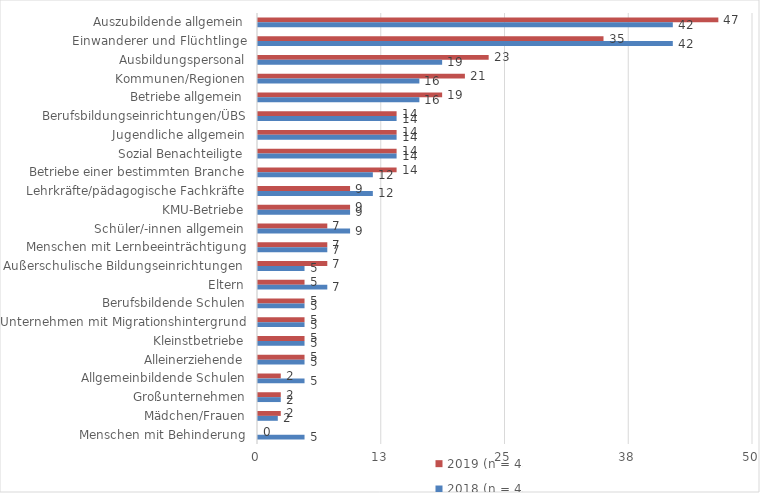
| Category | 2019 (n = 43) | 2018 (n = 43) |
|---|---|---|
| Auszubildende allgemein | 46.5 | 41.9 |
| Einwanderer und Flüchtlinge | 34.9 | 41.9 |
| Ausbildungspersonal | 23.3 | 18.6 |
| Kommunen/Regionen | 20.9 | 16.3 |
| Betriebe allgemein | 18.6 | 16.3 |
| Berufsbildungseinrichtungen/ÜBS | 14 | 14 |
| Jugendliche allgemein | 14 | 14 |
| Sozial Benachteiligte | 14 | 14 |
| Betriebe einer bestimmten Branche | 14 | 11.6 |
| Lehrkräfte/pädagogische Fachkräfte | 9.3 | 11.6 |
| KMU-Betriebe | 9.3 | 9.3 |
| Schüler/-innen allgemein | 7 | 9.3 |
| Menschen mit Lernbeeinträchtigung | 7 | 7 |
| Außerschulische Bildungseinrichtungen  | 7 | 4.7 |
| Eltern | 4.7 | 7 |
| Berufsbildende Schulen | 4.7 | 4.7 |
| Unternehmen mit Migrationshintergrund | 4.7 | 4.7 |
| Kleinstbetriebe | 4.7 | 4.7 |
| Alleinerziehende | 4.7 | 4.7 |
| Allgemeinbildende Schulen | 2.3 | 4.7 |
| Großunternehmen | 2.3 | 2.3 |
| Mädchen/Frauen | 2.3 | 2 |
| Menschen mit Behinderung | 0 | 4.7 |